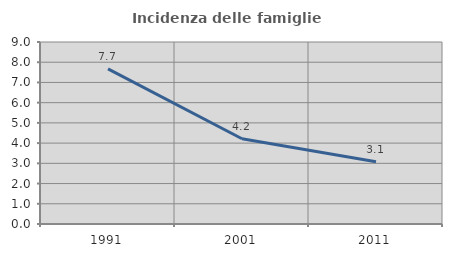
| Category | Incidenza delle famiglie numerose |
|---|---|
| 1991.0 | 7.672 |
| 2001.0 | 4.214 |
| 2011.0 | 3.075 |